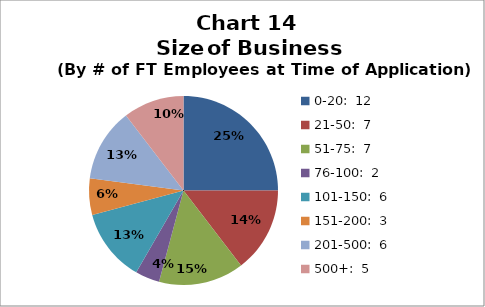
| Category | Series 0 |
|---|---|
| 0-20:  12 | 12 |
| 21-50:  7 | 7 |
| 51-75:  7 | 7 |
| 76-100:  2 | 2 |
| 101-150:  6 | 6 |
| 151-200:  3 | 3 |
| 201-500:  6 | 6 |
| 500+:  5 | 5 |